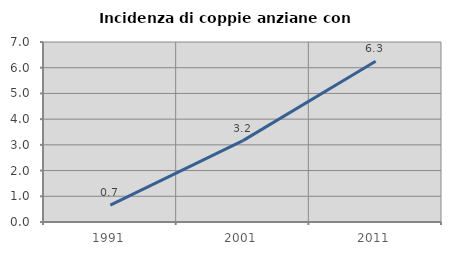
| Category | Incidenza di coppie anziane con figli |
|---|---|
| 1991.0 | 0.658 |
| 2001.0 | 3.165 |
| 2011.0 | 6.25 |